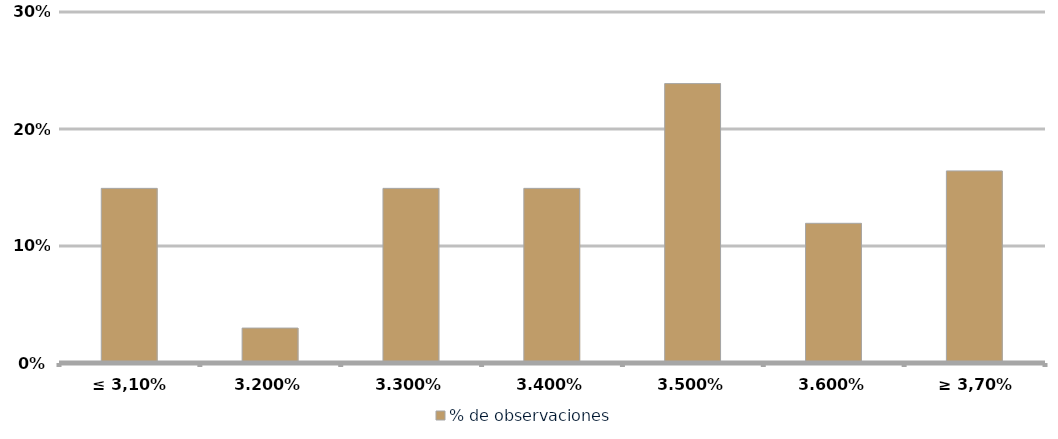
| Category | % de observaciones  |
|---|---|
| ≤ 3,10% | 0.149 |
| 3,20% | 0.03 |
| 3,30% | 0.149 |
| 3,40% | 0.149 |
| 3,50% | 0.239 |
| 3,60% | 0.119 |
| ≥ 3,70% | 0.164 |